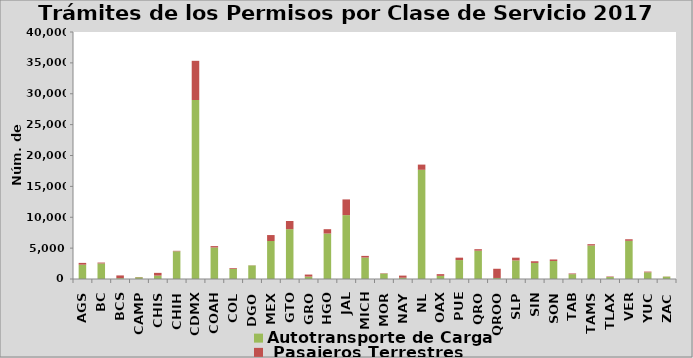
| Category | Autotransporte de Carga  |  Pasajeros Terrestres |
|---|---|---|
| AGS | 2322 | 286 |
| BC | 2523 | 139 |
| BCS | 134 | 445 |
| CAMP | 289 | 35 |
| CHIS | 552 | 442 |
| CHIH | 4483 | 80 |
| CDMX | 28991 | 6343 |
| COAH | 5101 | 227 |
| COL | 1637 | 122 |
| DGO | 2200 | 22 |
| MEX | 6158 | 959 |
| GTO | 8068 | 1323 |
| GRO | 389 | 330 |
| HGO | 7360 | 706 |
| JAL | 10344 | 2544 |
| MICH | 3473 | 269 |
| MOR | 876 | 59 |
| NAY | 205 | 346 |
| NL | 17685 | 841 |
| OAX | 511 | 276 |
| PUE | 3066 | 389 |
| QRO | 4590 | 237 |
| QROO | 167 | 1491 |
| SLP | 3011 | 443 |
| SIN | 2604 | 268 |
| SON | 2920 | 243 |
| TAB | 778 | 116 |
| TAMS | 5426 | 213 |
| TLAX | 329 | 75 |
| VER | 6189 | 246 |
| YUC | 1081 | 117 |
| ZAC | 384 | 24 |